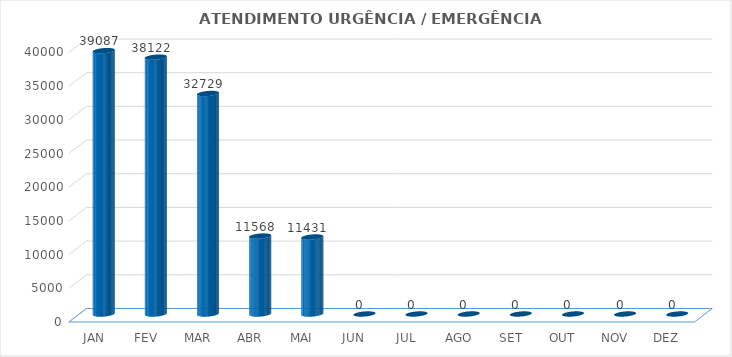
| Category | Series 0 |
|---|---|
| JAN | 39087 |
| FEV | 38122 |
| MAR | 32729 |
| ABR | 11568 |
| MAI | 11431 |
| JUN | 0 |
| JUL | 0 |
| AGO | 0 |
| SET | 0 |
| OUT | 0 |
| NOV | 0 |
| DEZ | 0 |